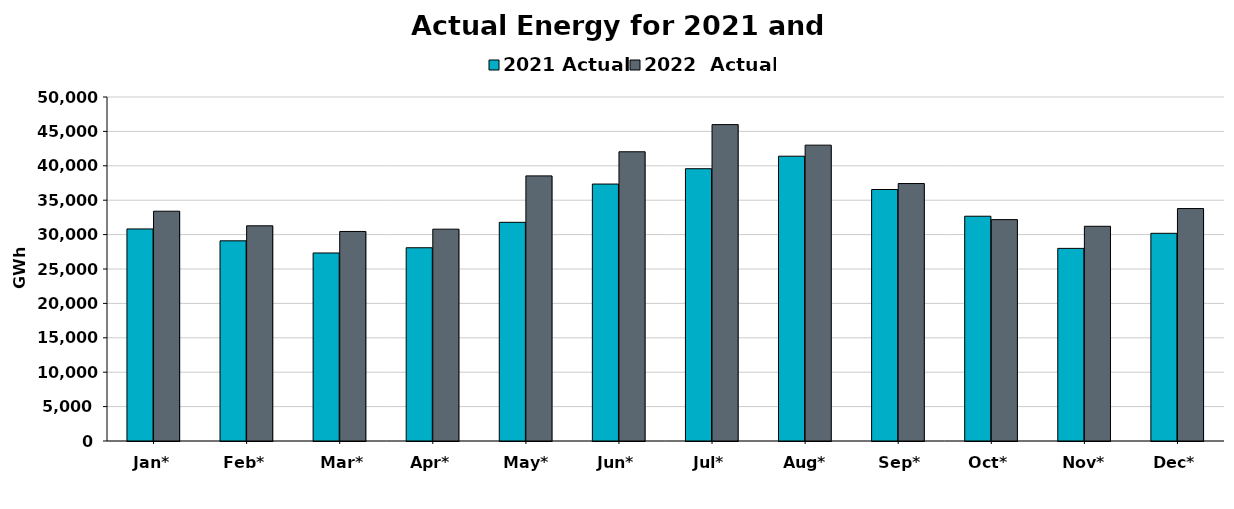
| Category | 2021 Actual | 2022  Actual |
|---|---|---|
| Jan* | 30822 | 33400 |
| Feb* | 29096 | 31279 |
| Mar* | 27328 | 30457 |
| Apr* | 28090 | 30790 |
| May* | 31785 | 38535 |
| Jun* | 37346 | 42039 |
| Jul* | 39577 | 45986 |
| Aug* | 41396 | 43002 |
| Sep* | 36555 | 37422 |
| Oct* | 32670 | 32179 |
| Nov* | 27996 | 31209 |
| Dec* | 30188 | 33786 |